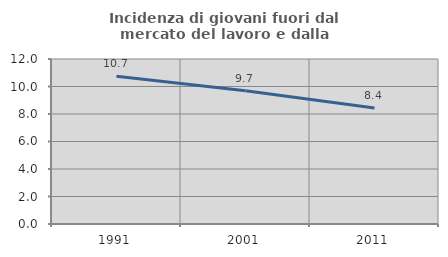
| Category | Incidenza di giovani fuori dal mercato del lavoro e dalla formazione  |
|---|---|
| 1991.0 | 10.746 |
| 2001.0 | 9.694 |
| 2011.0 | 8.443 |